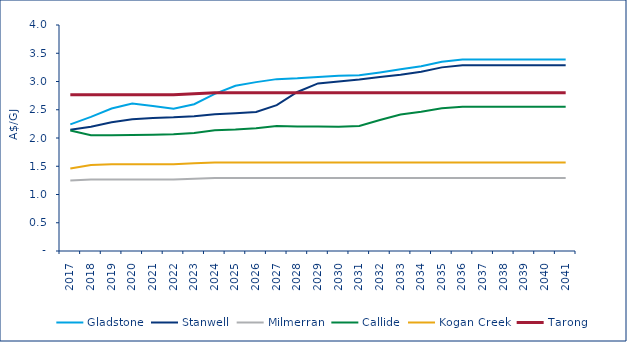
| Category | Gladstone | Stanwell | Milmerran | Callide | Kogan Creek | Tarong |
|---|---|---|---|---|---|---|
| 2017.0 | 2.242 | 2.145 | 1.249 | 2.132 | 1.459 | 2.766 |
| 2018.0 | 2.373 | 2.2 | 1.265 | 2.048 | 1.521 | 2.766 |
| 2019.0 | 2.523 | 2.279 | 1.265 | 2.048 | 1.535 | 2.766 |
| 2020.0 | 2.609 | 2.33 | 1.265 | 2.054 | 1.535 | 2.766 |
| 2021.0 | 2.567 | 2.356 | 1.265 | 2.058 | 1.535 | 2.766 |
| 2022.0 | 2.517 | 2.366 | 1.265 | 2.065 | 1.535 | 2.766 |
| 2023.0 | 2.598 | 2.387 | 1.278 | 2.09 | 1.551 | 2.784 |
| 2024.0 | 2.78 | 2.42 | 1.292 | 2.139 | 1.567 | 2.803 |
| 2025.0 | 2.925 | 2.439 | 1.292 | 2.152 | 1.567 | 2.803 |
| 2026.0 | 2.989 | 2.461 | 1.292 | 2.174 | 1.567 | 2.803 |
| 2027.0 | 3.042 | 2.581 | 1.292 | 2.212 | 1.567 | 2.803 |
| 2028.0 | 3.056 | 2.815 | 1.292 | 2.204 | 1.567 | 2.803 |
| 2029.0 | 3.079 | 2.966 | 1.292 | 2.203 | 1.567 | 2.803 |
| 2030.0 | 3.102 | 3.001 | 1.292 | 2.198 | 1.567 | 2.803 |
| 2031.0 | 3.11 | 3.035 | 1.292 | 2.212 | 1.567 | 2.803 |
| 2032.0 | 3.161 | 3.078 | 1.292 | 2.318 | 1.567 | 2.803 |
| 2033.0 | 3.215 | 3.12 | 1.292 | 2.416 | 1.567 | 2.803 |
| 2034.0 | 3.271 | 3.174 | 1.292 | 2.466 | 1.567 | 2.803 |
| 2035.0 | 3.349 | 3.25 | 1.292 | 2.525 | 1.567 | 2.803 |
| 2036.0 | 3.389 | 3.289 | 1.292 | 2.554 | 1.567 | 2.803 |
| 2037.0 | 3.389 | 3.289 | 1.292 | 2.554 | 1.567 | 2.803 |
| 2038.0 | 3.389 | 3.289 | 1.292 | 2.554 | 1.567 | 2.803 |
| 2039.0 | 3.389 | 3.289 | 1.292 | 2.554 | 1.567 | 2.803 |
| 2040.0 | 3.389 | 3.289 | 1.292 | 2.554 | 1.567 | 2.803 |
| 2041.0 | 3.389 | 3.289 | 1.292 | 2.554 | 1.567 | 2.803 |